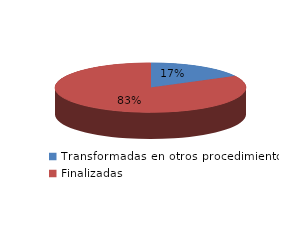
| Category | Series 0 |
|---|---|
| Transformadas en otros procedimientos | 3419 |
| Finalizadas | 16584 |